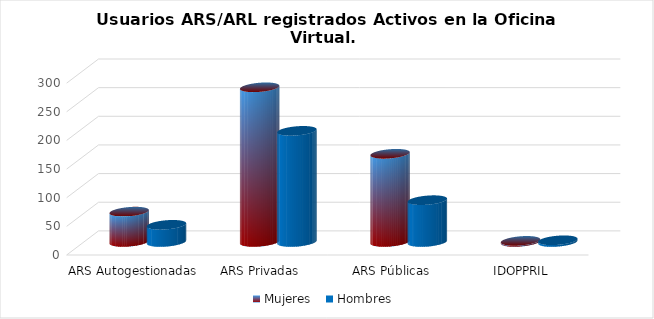
| Category | Mujeres | Hombres |
|---|---|---|
| ARS Autogestionadas | 53 | 30 |
| ARS Privadas | 270 | 194 |
| ARS Públicas | 154 | 73 |
| IDOPPRIL | 2 | 3 |